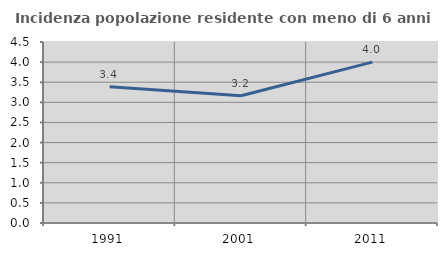
| Category | Incidenza popolazione residente con meno di 6 anni |
|---|---|
| 1991.0 | 3.388 |
| 2001.0 | 3.162 |
| 2011.0 | 4 |